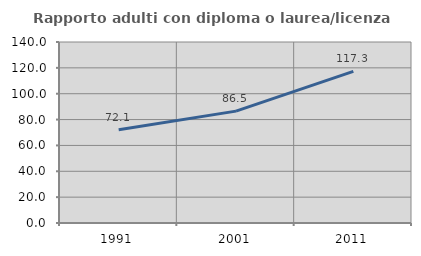
| Category | Rapporto adulti con diploma o laurea/licenza media  |
|---|---|
| 1991.0 | 72.093 |
| 2001.0 | 86.538 |
| 2011.0 | 117.333 |